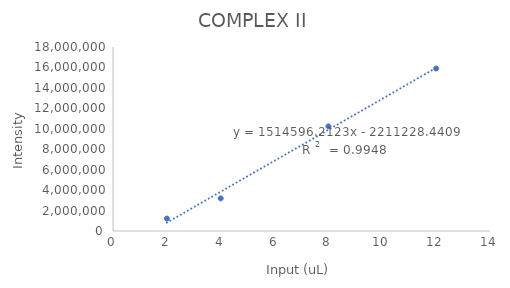
| Category | Series 0 |
|---|---|
| 8.0 | 10235795.75 |
| 4.0 | 3187372.475 |
| 2.0 | 1213689.333 |
| 12.0 | 15897730.197 |